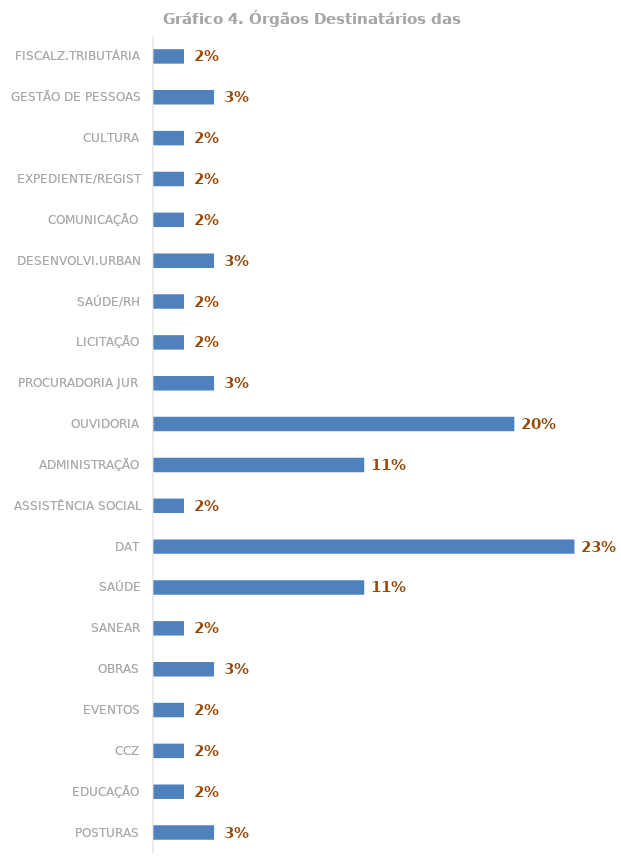
| Category | Total |
|---|---|
| POSTURAS | 0.033 |
| EDUCAÇÃO | 0.016 |
| CCZ | 0.016 |
| EVENTOS | 0.016 |
| OBRAS | 0.033 |
| SANEAR | 0.016 |
| SAÚDE | 0.115 |
| DAT | 0.23 |
| ASSISTÊNCIA SOCIAL | 0.016 |
| ADMINISTRAÇÃO | 0.115 |
| OUVIDORIA | 0.197 |
| PROCURADORIA JUR | 0.033 |
| LICITAÇÃO | 0.016 |
| SAÚDE/RH | 0.016 |
| DESENVOLVI.URBAN | 0.033 |
| COMUNICAÇÃO | 0.016 |
| EXPEDIENTE/REGIST | 0.016 |
| CULTURA | 0.016 |
| GESTÃO DE PESSOAS | 0.033 |
| FISCALZ.TRIBUTÁRIA | 0.016 |